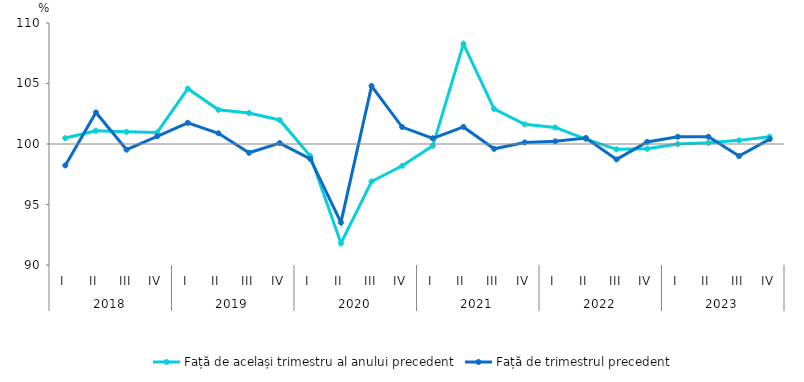
| Category | Față de același trimestru al anului precedent | Față de trimestrul precedent |
|---|---|---|
| 0 | 100.491 | 98.228 |
| 1 | 101.097 | 102.604 |
| 2 | 101.008 | 99.53 |
| 3 | 100.954 | 100.639 |
| 4 | 104.574 | 101.751 |
| 5 | 102.823 | 100.886 |
| 6 | 102.56 | 99.275 |
| 7 | 101.986 | 100.076 |
| 8 | 99 | 98.772 |
| 9 | 91.8 | 93.516 |
| 10 | 96.9 | 104.788 |
| 11 | 98.2 | 101.4 |
| 12 | 99.847 | 100.472 |
| 13 | 108.274 | 101.409 |
| 14 | 102.9 | 99.6 |
| 15 | 101.623 | 100.13 |
| 16 | 101.369 | 100.22 |
| 17 | 100.4 | 100.5 |
| 18 | 99.559 | 98.729 |
| 19 | 99.601 | 100.173 |
| 20 | 100 | 100.6 |
| 21 | 100.1 | 100.6 |
| 22 | 100.3 | 99 |
| 23 | 100.6 | 100.4 |